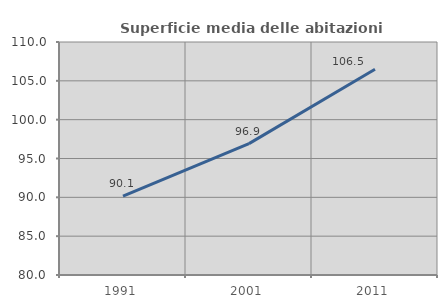
| Category | Superficie media delle abitazioni occupate |
|---|---|
| 1991.0 | 90.147 |
| 2001.0 | 96.919 |
| 2011.0 | 106.488 |